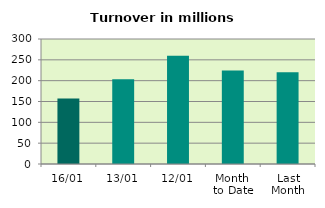
| Category | Series 0 |
|---|---|
| 16/01 | 157.085 |
| 13/01 | 203.575 |
| 12/01 | 259.544 |
| Month 
to Date | 224.297 |
| Last
Month | 219.947 |